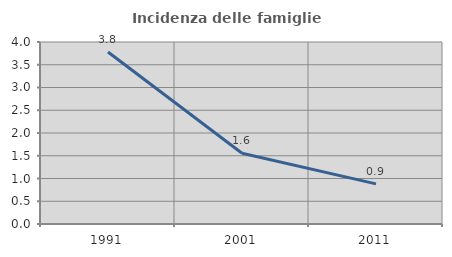
| Category | Incidenza delle famiglie numerose |
|---|---|
| 1991.0 | 3.782 |
| 2001.0 | 1.556 |
| 2011.0 | 0.881 |